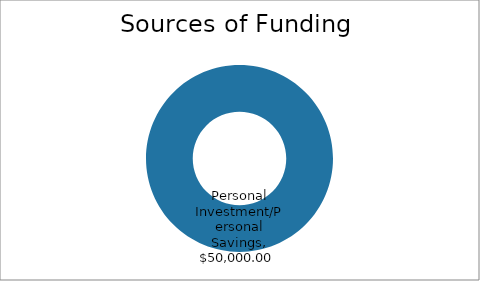
| Category | Sources of Funding |
|---|---|
| Personal Investment/Personal Savings | 50000 |
| Outside Investment | 0 |
| Loans | 0 |